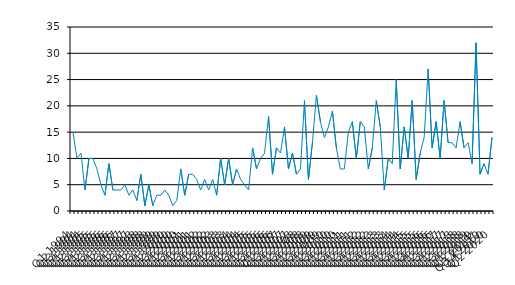
| Category | Series 0 |
|---|---|
| Q1 1994 | 15 |
| Q2 1994 | 10 |
| Q3 1994 | 11 |
| Q4 1994 | 4 |
| Q1 1995 | 10 |
| Q2 1995 | 10 |
| Q3 1995 | 8 |
| Q4 1995 | 5 |
| Q1 1996 | 3 |
| Q2 1996 | 9 |
| Q3 1996 | 4 |
| Q4 1996 | 4 |
| Q1 1997 | 4 |
| Q2 1997 | 5 |
| Q3 1997 | 3 |
| Q4 1997 | 4 |
| Q1 1998 | 2 |
| Q2 1998 | 7 |
| Q3 1998 | 1 |
| Q4 1998 | 5 |
| Q1 1999 | 1 |
| Q2 1999 | 3 |
| Q3 1999 | 3 |
| Q4 1999 | 4 |
| Q1 2000 | 3 |
| Q2 2000 | 1 |
| Q3 2000 | 2 |
| Q4 2000 | 8 |
| Q1 2001 | 3 |
| Q2 2001 | 7 |
| Q3 2001 | 7 |
| Q4 2001 | 6 |
| Q1 2002 | 4 |
| Q2 2002 | 6 |
| Q3 2002 | 4 |
| Q4 2002 | 6 |
| Q1 2003 | 3 |
| Q2 2003 | 10 |
| Q3 2003 | 5 |
| Q4 2003 | 10 |
| Q1 2004 | 5 |
| Q2 2004 | 8 |
| Q3 2004 | 6 |
| Q4 2004 | 5 |
| Q1 2005 | 4 |
| Q2 2005 | 12 |
| Q3 2005 | 8 |
| Q4 2005 | 10 |
| Q1 2006 | 11 |
| Q2 2006 | 18 |
| Q3 2006 | 7 |
| Q4 2006 | 12 |
| Q1 2007 | 11 |
| Q2 2007 | 16 |
| Q3 2007 | 8 |
| Q4 2007 | 11 |
| Q1 2008 | 7 |
| Q2 2008 | 8 |
| Q3 2008 | 21 |
| Q4 2008 | 6 |
| Q1 2009 | 13 |
| Q2 2009 | 22 |
| Q3 2009 | 17 |
| Q4 2009 | 14 |
| Q1 2010 | 16 |
| Q2 2010 | 19 |
| Q3 2010 | 12 |
| Q4 2010 | 8 |
| Q1 2011 | 8 |
| Q2 2011 | 15 |
| Q3 2011 | 17 |
| Q4 2011 | 10 |
| Q1 2012 | 17 |
| Q2 2012 | 16 |
| Q3 2012 | 8 |
| Q4 2012 | 12 |
| Q1 2013 | 21 |
| Q2 2013 | 16 |
| Q3 2013 | 4 |
| Q4 2013 | 10 |
| Q1 2014 | 9 |
| Q2 2014 | 25 |
| Q3 2014 | 8 |
| Q4 2014 | 16 |
| Q1 2015 | 10 |
| Q2 2015 | 21 |
| Q3 2015 | 6 |
| Q4 2015 | 11 |
| Q1 2016 | 14 |
| Q2 2016 | 27 |
| Q3 2016 | 12 |
| Q4 2016 | 17 |
| Q1 2017 | 10 |
| Q2 2017 | 21 |
| Q3 2017 | 13 |
| Q4 2017 | 13 |
| Q1 2018 | 12 |
| Q2 2018 | 17 |
| Q3 2018 | 12 |
| Q4 2018 | 13 |
| Q1 2019 | 9 |
| Q2 2019 | 32 |
| Q3 2019* | 7 |
| Q4 2019 | 9 |
| Q1 2020 | 7 |
| Q2 2020 | 14 |